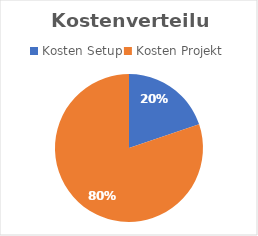
| Category | Series 0 |
|---|---|
| Kosten Setup | 39150 |
| Kosten Projekt | 158333.333 |